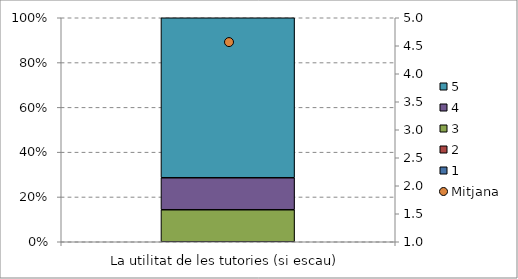
| Category | 1 | 2 | 3 | 4 | 5 |
|---|---|---|---|---|---|
| La utilitat de les tutories (si escau) | 0 | 0 | 0.143 | 0.143 | 0.714 |